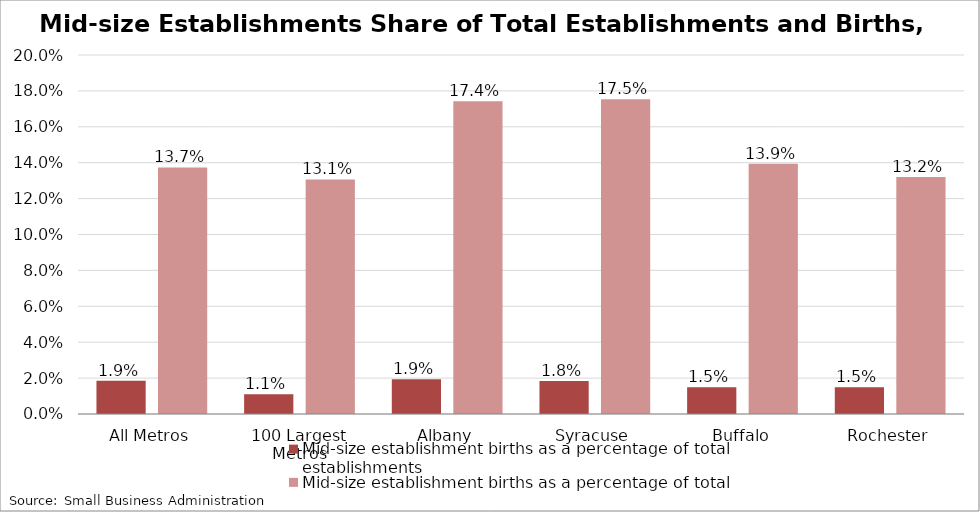
| Category | Mid-size establishment births as a percentage of total establishments | Mid-size establishment births as a percentage of total establishment births |
|---|---|---|
| All Metros | 0.019 | 0.137 |
| 100 Largest Metros | 0.011 | 0.131 |
| Albany | 0.019 | 0.174 |
| Syracuse | 0.018 | 0.175 |
| Buffalo | 0.015 | 0.139 |
| Rochester | 0.015 | 0.132 |